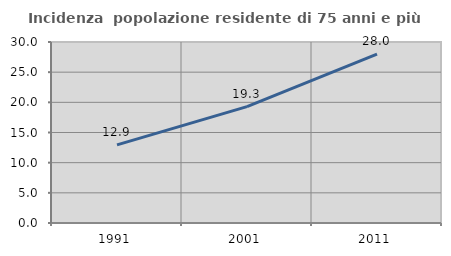
| Category | Incidenza  popolazione residente di 75 anni e più |
|---|---|
| 1991.0 | 12.946 |
| 2001.0 | 19.296 |
| 2011.0 | 27.975 |